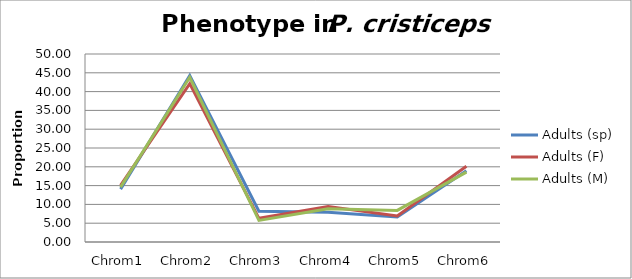
| Category | Adults (sp) | Adults (F)  | Adults (M) |
|---|---|---|---|
| Chrom1 | 14.066 | 15.094 | 14.602 |
| Chrom2 | 44.246 | 42.138 | 43.805 |
| Chrom3 | 8.184 | 6.289 | 5.752 |
| Chrom4 | 7.928 | 9.434 | 8.85 |
| Chrom5 | 6.65 | 6.918 | 8.407 |
| Chrom6 | 18.926 | 20.126 | 18.584 |